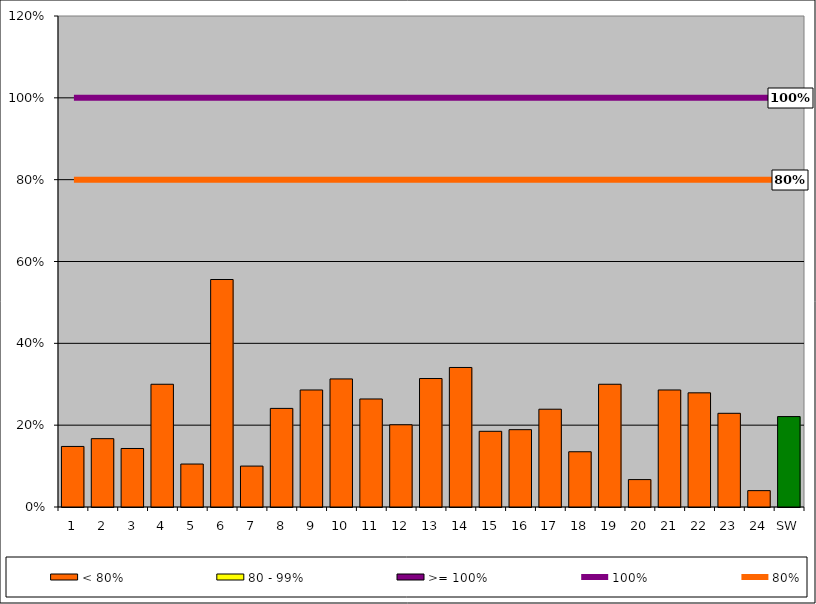
| Category | < 80% | 80 - 99% | >= 100% |
|---|---|---|---|
| 1 | 0.148 | 0 | 0 |
| 2 | 0.167 | 0 | 0 |
| 3 | 0.143 | 0 | 0 |
| 4 | 0.3 | 0 | 0 |
| 5 | 0.105 | 0 | 0 |
| 6 | 0.556 | 0 | 0 |
| 7 | 0.1 | 0 | 0 |
| 8 | 0.241 | 0 | 0 |
| 9 | 0.286 | 0 | 0 |
| 10 | 0.313 | 0 | 0 |
| 11 | 0.264 | 0 | 0 |
| 12 | 0.201 | 0 | 0 |
| 13 | 0.314 | 0 | 0 |
| 14 | 0.341 | 0 | 0 |
| 15 | 0.185 | 0 | 0 |
| 16 | 0.189 | 0 | 0 |
| 17 | 0.239 | 0 | 0 |
| 18 | 0.135 | 0 | 0 |
| 19 | 0.3 | 0 | 0 |
| 20 | 0.067 | 0 | 0 |
| 21 | 0.286 | 0 | 0 |
| 22 | 0.279 | 0 | 0 |
| 23 | 0.229 | 0 | 0 |
| 24 | 0.04 | 0 | 0 |
| SW | 0.221 | 0 | 0 |